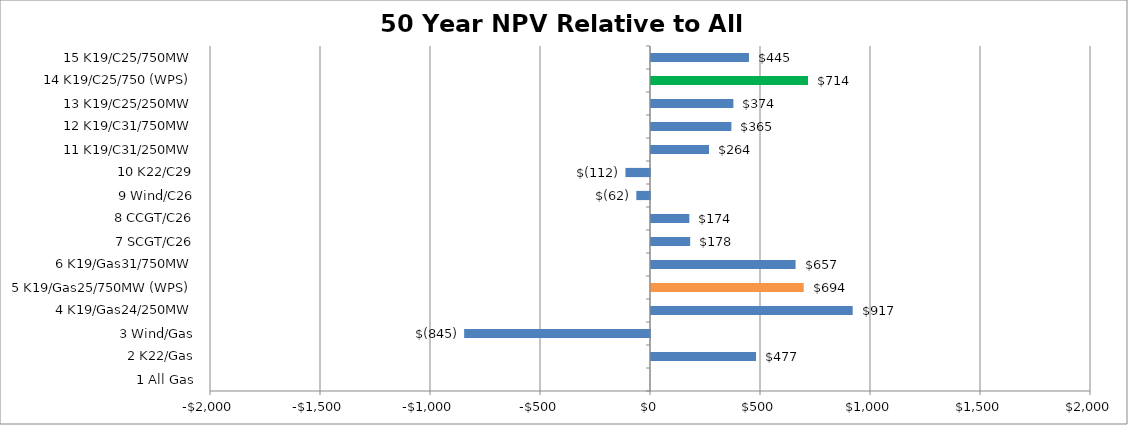
| Category | 50 NPV |
|---|---|
| 1 All Gas | 0 |
| 2 K22/Gas | 477.442 |
| 3 Wind/Gas | -844.801 |
| 4 K19/Gas24/250MW | 916.811 |
| 5 K19/Gas25/750MW (WPS) | 694.305 |
| 6 K19/Gas31/750MW | 657.198 |
| 7 SCGT/C26 | 178.082 |
| 8 CCGT/C26 | 174.231 |
| 9 Wind/C26 | -62.083 |
| 10 K22/C29 | -111.603 |
| 11 K19/C31/250MW | 263.689 |
| 12 K19/C31/750MW | 365.394 |
| 13 K19/C25/250MW | 374.478 |
| 14 K19/C25/750 (WPS) | 713.609 |
| 15 K19/C25/750MW | 445.221 |